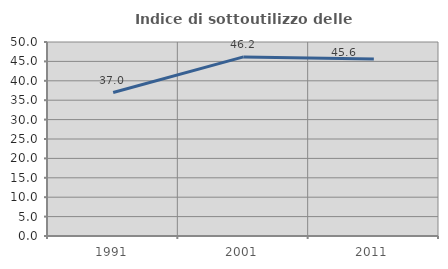
| Category | Indice di sottoutilizzo delle abitazioni  |
|---|---|
| 1991.0 | 36.979 |
| 2001.0 | 46.159 |
| 2011.0 | 45.591 |